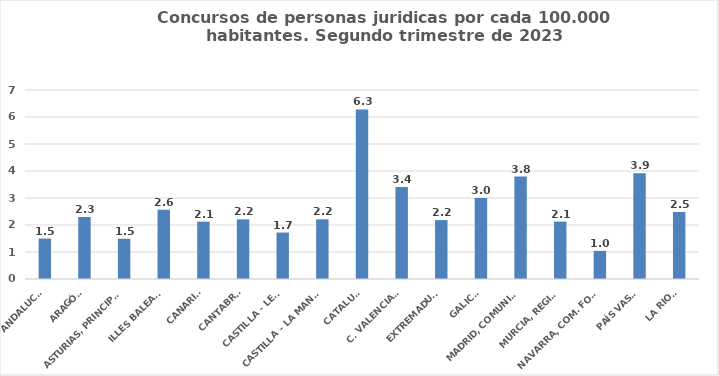
| Category | Series 0 |
|---|---|
| ANDALUCÍA | 1.498 |
| ARAGÓN | 2.297 |
| ASTURIAS, PRINCIPADO | 1.49 |
| ILLES BALEARS | 2.569 |
| CANARIAS | 2.124 |
| CANTABRIA | 2.209 |
| CASTILLA - LEÓN | 1.721 |
| CASTILLA - LA MANCHA | 2.211 |
| CATALUÑA | 6.279 |
| C. VALENCIANA | 3.411 |
| EXTREMADURA | 2.182 |
| GALICIA | 3 |
| MADRID, COMUNIDAD | 3.796 |
| MURCIA, REGIÓN | 2.125 |
| NAVARRA, COM. FORAL | 1.041 |
| PAÍS VASCO | 3.919 |
| LA RIOJA | 2.482 |